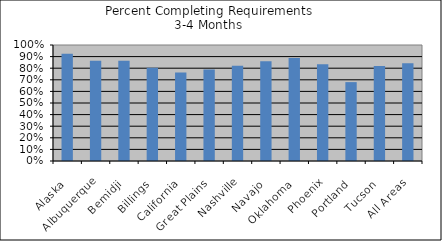
| Category | % Comp. Req. |
|---|---|
| Alaska | 0.924 |
| Albuquerque | 0.865 |
| Bemidji | 0.864 |
| Billings | 0.803 |
| California | 0.763 |
| Great Plains | 0.79 |
| Nashville | 0.821 |
| Navajo | 0.861 |
| Oklahoma | 0.887 |
| Phoenix | 0.833 |
| Portland | 0.68 |
| Tucson | 0.818 |
|  All Areas | 0.843 |